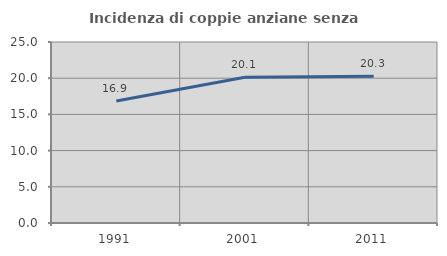
| Category | Incidenza di coppie anziane senza figli  |
|---|---|
| 1991.0 | 16.86 |
| 2001.0 | 20.134 |
| 2011.0 | 20.28 |